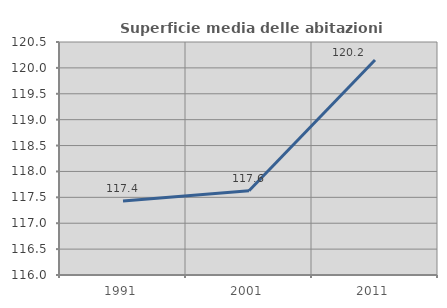
| Category | Superficie media delle abitazioni occupate |
|---|---|
| 1991.0 | 117.43 |
| 2001.0 | 117.626 |
| 2011.0 | 120.152 |